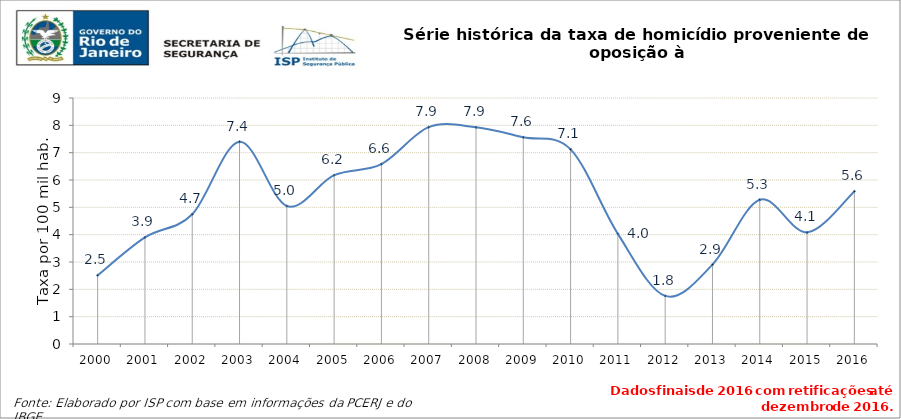
| Category | Series 0 |
|---|---|
| 2000.0 | 2.513 |
| 2001.0 | 3.902 |
| 2002.0 | 4.747 |
| 2003.0 | 7.399 |
| 2004.0 | 5.048 |
| 2005.0 | 6.177 |
| 2006.0 | 6.582 |
| 2007.0 | 7.933 |
| 2008.0 | 7.927 |
| 2009.0 | 7.562 |
| 2010.0 | 7.12 |
| 2011.0 | 4.029 |
| 2012.0 | 1.759 |
| 2013.0 | 2.904 |
| 2014.0 | 5.277 |
| 2015.0 | 4.083 |
| 2016.0 | 5.583 |